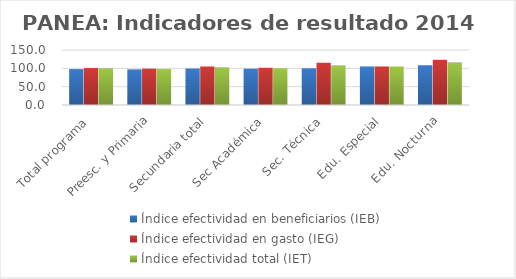
| Category | Índice efectividad en beneficiarios (IEB) | Índice efectividad en gasto (IEG)  | Índice efectividad total (IET) |
|---|---|---|---|
| Total programa | 97.925 | 100.736 | 99.331 |
| Preesc. y Primaria | 97.166 | 98.954 | 98.06 |
| Secundaria total | 99.231 | 105.006 | 102.119 |
| Sec Académica | 98.888 | 101.301 | 100.094 |
| Sec. Técnica | 100.095 | 115.127 | 107.611 |
| Edu. Especial | 105.145 | 105.019 | 105.082 |
| Edu. Nocturna | 108.426 | 123.218 | 115.822 |